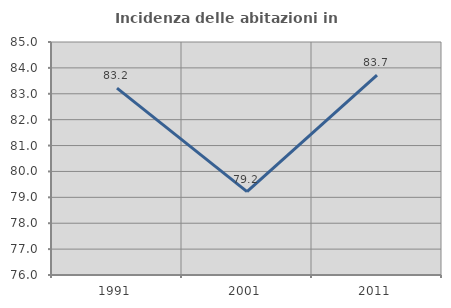
| Category | Incidenza delle abitazioni in proprietà  |
|---|---|
| 1991.0 | 83.217 |
| 2001.0 | 79.221 |
| 2011.0 | 83.721 |